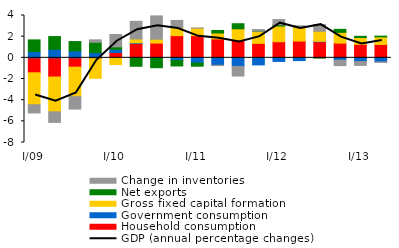
| Category | Household consumption | Government consumption | Gross fixed capital formation | Net exports | Change in inventories |
|---|---|---|---|---|---|
| I/09 | -1.413 | 0.594 | -3.02 | 1.102 | -0.776 |
| II | -1.814 | 0.808 | -3.289 | 1.201 | -0.997 |
| III | -0.879 | 0.65 | -2.791 | 0.886 | -1.173 |
| IV | -0.084 | 0.486 | -1.85 | 0.98 | 0.233 |
| I/10 | 0.5 | 0.305 | -0.636 | 0.234 | 1.168 |
| II | 1.35 | 0.071 | 0.361 | -0.795 | 1.668 |
| III | 1.396 | -0.066 | 0.364 | -0.864 | 2.204 |
| IV | 2.098 | -0.243 | 0.75 | -0.524 | 0.685 |
| I/11 | 2.096 | -0.495 | 0.704 | -0.295 | 0.021 |
| II | 1.789 | -0.704 | 0.554 | 0.244 | -0.028 |
| III | 1.673 | -0.811 | 1.071 | 0.478 | -0.91 |
| IV | 1.366 | -0.668 | 1.14 | 0.019 | 0.149 |
| I/12 | 1.521 | -0.34 | 1.478 | 0.117 | 0.499 |
| II | 1.585 | -0.259 | 1.356 | 0.02 | 0.073 |
| III | 1.521 | 0.037 | 0.954 | -0.017 | 0.637 |
| IV | 1.389 | -0.216 | 1.022 | 0.279 | -0.522 |
| I/13 | 1.276 | -0.35 | 0.645 | 0.111 | -0.365 |
| II | 1.265 | -0.382 | 0.716 | 0.07 | -0.035 |